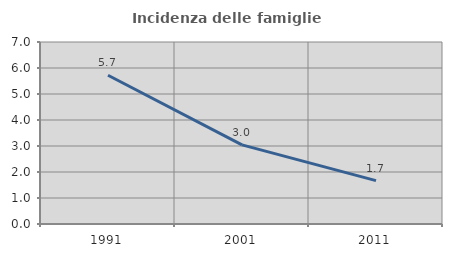
| Category | Incidenza delle famiglie numerose |
|---|---|
| 1991.0 | 5.72 |
| 2001.0 | 3.043 |
| 2011.0 | 1.67 |